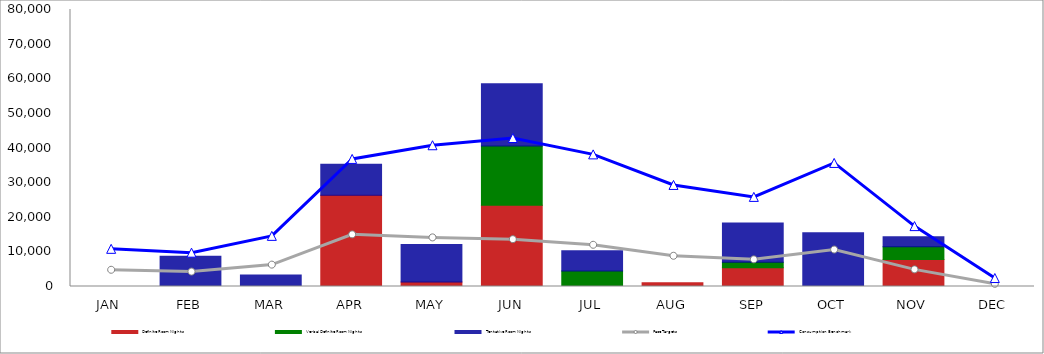
| Category | Definite Room Nights | Verbal Definite Room Nights | Tentative Room Nights |
|---|---|---|---|
| JAN | 0 | 0 | 0 |
| FEB | 0 | 0 | 8750 |
| MAR | 0 | 0 | 3340 |
| APR | 26356 | 0 | 8938 |
| MAY | 1308 | 0 | 10822 |
| JUN | 23459 | 17100 | 17993 |
| JUL | 0 | 4474 | 5827 |
| AUG | 1056 | 0 | 0 |
| SEP | 5415 | 1570 | 11342 |
| OCT | 0 | 0 | 15537 |
| NOV | 7826 | 3670 | 2890 |
| DEC | 0 | 0 | 0 |